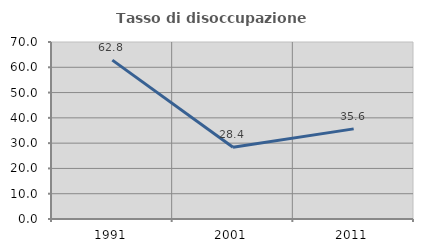
| Category | Tasso di disoccupazione giovanile  |
|---|---|
| 1991.0 | 62.832 |
| 2001.0 | 28.358 |
| 2011.0 | 35.644 |